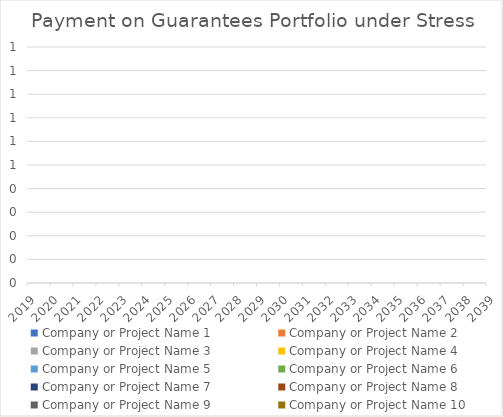
| Category | Company or Project Name 1 | Company or Project Name 2 | Company or Project Name 3 | Company or Project Name 4 | Company or Project Name 5 | Company or Project Name 6 | Company or Project Name 7 | Company or Project Name 8 | Company or Project Name 9 | Company or Project Name 10 |
|---|---|---|---|---|---|---|---|---|---|---|
| 2019.0 | 0 | 0 | 0 | 0 | 0 | 0 | 0 | 0 | 0 | 0 |
| 2020.0 | 0 | 0 | 0 | 0 | 0 | 0 | 0 | 0 | 0 | 0 |
| 2021.0 | 0 | 0 | 0 | 0 | 0 | 0 | 0 | 0 | 0 | 0 |
| 2022.0 | 0 | 0 | 0 | 0 | 0 | 0 | 0 | 0 | 0 | 0 |
| 2023.0 | 0 | 0 | 0 | 0 | 0 | 0 | 0 | 0 | 0 | 0 |
| 2024.0 | 0 | 0 | 0 | 0 | 0 | 0 | 0 | 0 | 0 | 0 |
| 2025.0 | 0 | 0 | 0 | 0 | 0 | 0 | 0 | 0 | 0 | 0 |
| 2026.0 | 0 | 0 | 0 | 0 | 0 | 0 | 0 | 0 | 0 | 0 |
| 2027.0 | 0 | 0 | 0 | 0 | 0 | 0 | 0 | 0 | 0 | 0 |
| 2028.0 | 0 | 0 | 0 | 0 | 0 | 0 | 0 | 0 | 0 | 0 |
| 2029.0 | 0 | 0 | 0 | 0 | 0 | 0 | 0 | 0 | 0 | 0 |
| 2030.0 | 0 | 0 | 0 | 0 | 0 | 0 | 0 | 0 | 0 | 0 |
| 2031.0 | 0 | 0 | 0 | 0 | 0 | 0 | 0 | 0 | 0 | 0 |
| 2032.0 | 0 | 0 | 0 | 0 | 0 | 0 | 0 | 0 | 0 | 0 |
| 2033.0 | 0 | 0 | 0 | 0 | 0 | 0 | 0 | 0 | 0 | 0 |
| 2034.0 | 0 | 0 | 0 | 0 | 0 | 0 | 0 | 0 | 0 | 0 |
| 2035.0 | 0 | 0 | 0 | 0 | 0 | 0 | 0 | 0 | 0 | 0 |
| 2036.0 | 0 | 0 | 0 | 0 | 0 | 0 | 0 | 0 | 0 | 0 |
| 2037.0 | 0 | 0 | 0 | 0 | 0 | 0 | 0 | 0 | 0 | 0 |
| 2038.0 | 0 | 0 | 0 | 0 | 0 | 0 | 0 | 0 | 0 | 0 |
| 2039.0 | 0 | 0 | 0 | 0 | 0 | 0 | 0 | 0 | 0 | 0 |